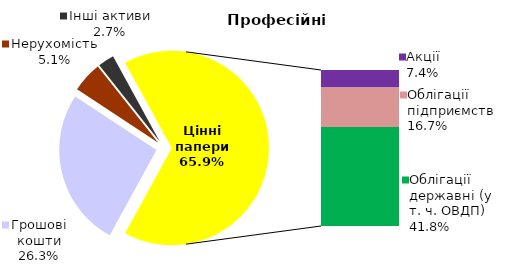
| Category | Професійні |
|---|---|
| Грошові кошти | 36.761 |
| Банківські метали | 0 |
| Нерухомість | 7.062 |
| Інші активи | 3.786 |
| Акції | 10.388 |
| Облігації підприємств | 23.292 |
| Муніципальні облігації | 0 |
| Облігації державні (у т. ч. ОВДП) | 58.46 |